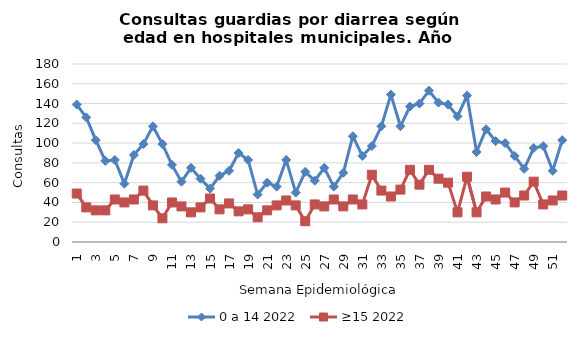
| Category | 0 a 14 2022 | ≥15 2022 |
|---|---|---|
| 1.0 | 139 | 49 |
| 2.0 | 126 | 35 |
| 3.0 | 103 | 32 |
| 4.0 | 82 | 32 |
| 5.0 | 83 | 43 |
| 6.0 | 59 | 40 |
| 7.0 | 88 | 43 |
| 8.0 | 99 | 52 |
| 9.0 | 117 | 37 |
| 10.0 | 99 | 24 |
| 11.0 | 78 | 40 |
| 12.0 | 61 | 36 |
| 13.0 | 75 | 30 |
| 14.0 | 64 | 35 |
| 15.0 | 54 | 44 |
| 16.0 | 67 | 33 |
| 17.0 | 72 | 39 |
| 18.0 | 90 | 31 |
| 19.0 | 83 | 33 |
| 20.0 | 48 | 25 |
| 21.0 | 60 | 32 |
| 22.0 | 56 | 37 |
| 23.0 | 83 | 42 |
| 24.0 | 50 | 37 |
| 25.0 | 71 | 21 |
| 26.0 | 62 | 38 |
| 27.0 | 75 | 36 |
| 28.0 | 56 | 43 |
| 29.0 | 70 | 36 |
| 30.0 | 107 | 43 |
| 31.0 | 87 | 38 |
| 32.0 | 97 | 68 |
| 33.0 | 117 | 52 |
| 34.0 | 149 | 46 |
| 35.0 | 117 | 53 |
| 36.0 | 137 | 73 |
| 37.0 | 140 | 58 |
| 38.0 | 153 | 73 |
| 39.0 | 141 | 64 |
| 40.0 | 139 | 60 |
| 41.0 | 127 | 30 |
| 42.0 | 148 | 66 |
| 43.0 | 91 | 30 |
| 44.0 | 114 | 46 |
| 45.0 | 102 | 43 |
| 46.0 | 100 | 50 |
| 47.0 | 87 | 40 |
| 48.0 | 74 | 47 |
| 49.0 | 95 | 61 |
| 50.0 | 97 | 38 |
| 51.0 | 72 | 42 |
| 52.0 | 103 | 47 |